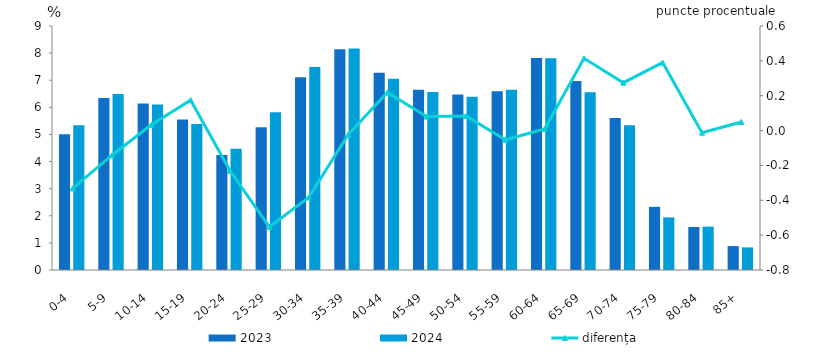
| Category | 2023 | 2024 |
|---|---|---|
| 0-4 | 5.003 | 5.335 |
| 5-9 | 6.348 | 6.49 |
| 10-14 | 6.139 | 6.106 |
| 15-19 | 5.555 | 5.381 |
| 20-24 | 4.245 | 4.476 |
| 25-29 | 5.264 | 5.817 |
| 30-34 | 7.106 | 7.489 |
| 35-39 | 8.146 | 8.171 |
| 40-44 | 7.274 | 7.056 |
| 45-49 | 6.646 | 6.566 |
| 50-54 | 6.477 | 6.394 |
| 55-59 | 6.594 | 6.647 |
| 60-64 | 7.823 | 7.813 |
| 65-69 | 6.968 | 6.553 |
| 70-74 | 5.61 | 5.335 |
| 75-79 | 2.331 | 1.941 |
| 80-84 | 1.587 | 1.599 |
| 85+ | 0.882 | 0.833 |